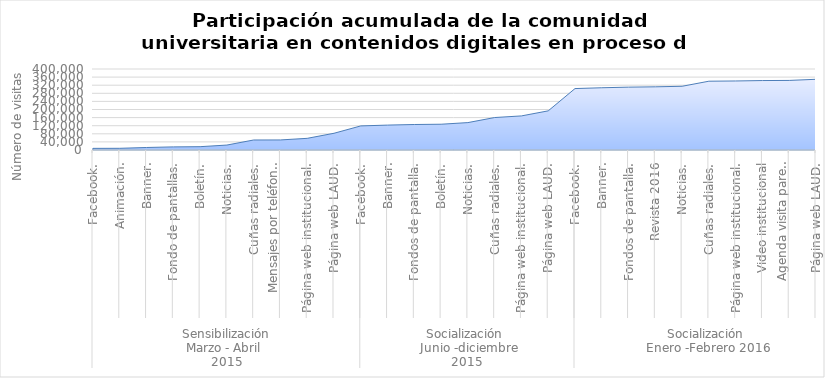
| Category | Series 0 |
|---|---|
| 0 | 8096 |
| 1 | 8397 |
| 2 | 12397 |
| 3 | 15358 |
| 4 | 16421 |
| 5 | 24421 |
| 6 | 49421 |
| 7 | 49621 |
| 8 | 57621 |
| 9 | 82621 |
| 10 | 118918 |
| 11 | 122918 |
| 12 | 125879 |
| 13 | 127288 |
| 14 | 135288 |
| 15 | 160288 |
| 16 | 168288 |
| 17 | 193288 |
| 18 | 303385 |
| 19 | 307385 |
| 20 | 310346 |
| 21 | 312032 |
| 22 | 314698.667 |
| 23 | 339698.667 |
| 24 | 340839.667 |
| 25 | 342904.667 |
| 26 | 343533.667 |
| 27 | 349173 |